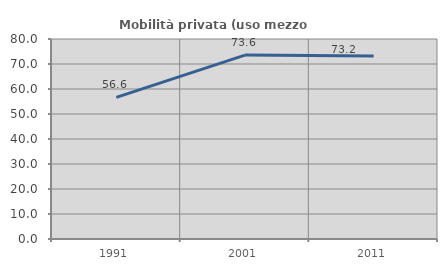
| Category | Mobilità privata (uso mezzo privato) |
|---|---|
| 1991.0 | 56.631 |
| 2001.0 | 73.58 |
| 2011.0 | 73.167 |